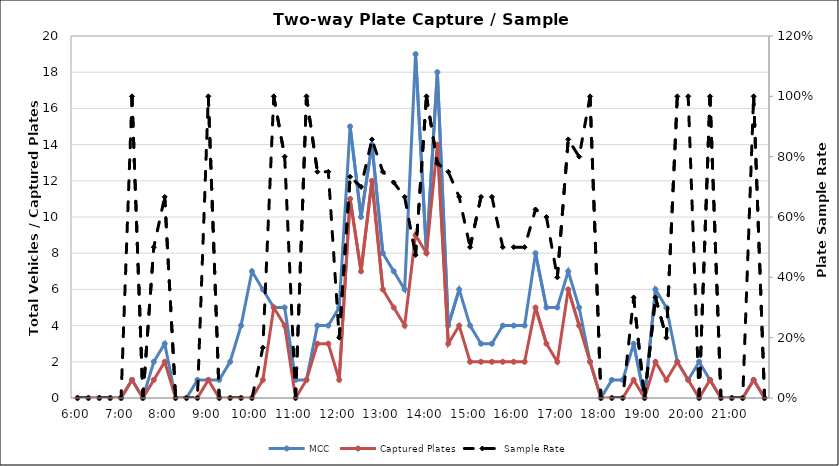
| Category | MCC | Captured Plates |
|---|---|---|
| 0.25 | 0 | 0 |
| 0.260416666666667 | 0 | 0 |
| 0.270833333333333 | 0 | 0 |
| 0.28125 | 0 | 0 |
| 0.291666666666667 | 0 | 0 |
| 0.302083333333333 | 1 | 1 |
| 0.3125 | 0 | 0 |
| 0.322916666666667 | 2 | 1 |
| 0.333333333333333 | 3 | 2 |
| 0.34375 | 0 | 0 |
| 0.354166666666667 | 0 | 0 |
| 0.364583333333333 | 1 | 0 |
| 0.375 | 1 | 1 |
| 0.385416666666667 | 1 | 0 |
| 0.395833333333333 | 2 | 0 |
| 0.40625 | 4 | 0 |
| 0.416666666666667 | 7 | 0 |
| 0.427083333333333 | 6 | 1 |
| 0.4375 | 5 | 5 |
| 0.447916666666667 | 5 | 4 |
| 0.458333333333333 | 1 | 0 |
| 0.46875 | 1 | 1 |
| 0.479166666666667 | 4 | 3 |
| 0.489583333333333 | 4 | 3 |
| 0.5 | 5 | 1 |
| 0.510416666666667 | 15 | 11 |
| 0.520833333333333 | 10 | 7 |
| 0.53125 | 14 | 12 |
| 0.541666666666667 | 8 | 6 |
| 0.552083333333333 | 7 | 5 |
| 0.5625 | 6 | 4 |
| 0.572916666666667 | 19 | 9 |
| 0.583333333333333 | 8 | 8 |
| 0.59375 | 18 | 14 |
| 0.604166666666667 | 4 | 3 |
| 0.614583333333333 | 6 | 4 |
| 0.625 | 4 | 2 |
| 0.635416666666667 | 3 | 2 |
| 0.645833333333333 | 3 | 2 |
| 0.65625 | 4 | 2 |
| 0.666666666666667 | 4 | 2 |
| 0.677083333333333 | 4 | 2 |
| 0.6875 | 8 | 5 |
| 0.697916666666667 | 5 | 3 |
| 0.708333333333333 | 5 | 2 |
| 0.71875 | 7 | 6 |
| 0.729166666666667 | 5 | 4 |
| 0.739583333333333 | 2 | 2 |
| 0.75 | 0 | 0 |
| 0.760416666666667 | 1 | 0 |
| 0.770833333333333 | 1 | 0 |
| 0.78125 | 3 | 1 |
| 0.791666666666667 | 0 | 0 |
| 0.802083333333333 | 6 | 2 |
| 0.8125 | 5 | 1 |
| 0.822916666666667 | 2 | 2 |
| 0.833333333333333 | 1 | 1 |
| 0.84375 | 2 | 0 |
| 0.854166666666667 | 1 | 1 |
| 0.864583333333333 | 0 | 0 |
| 0.875 | 0 | 0 |
| 0.885416666666667 | 0 | 0 |
| 0.895833333333333 | 1 | 1 |
| 0.90625 | 0 | 0 |